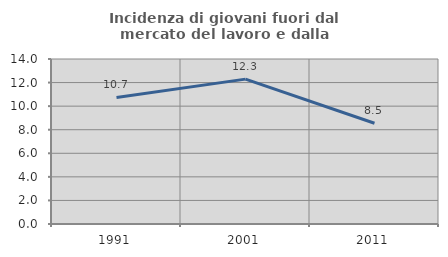
| Category | Incidenza di giovani fuori dal mercato del lavoro e dalla formazione  |
|---|---|
| 1991.0 | 10.742 |
| 2001.0 | 12.292 |
| 2011.0 | 8.547 |